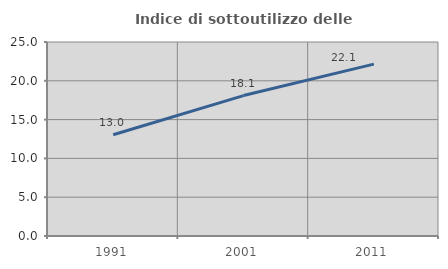
| Category | Indice di sottoutilizzo delle abitazioni  |
|---|---|
| 1991.0 | 13.047 |
| 2001.0 | 18.097 |
| 2011.0 | 22.148 |